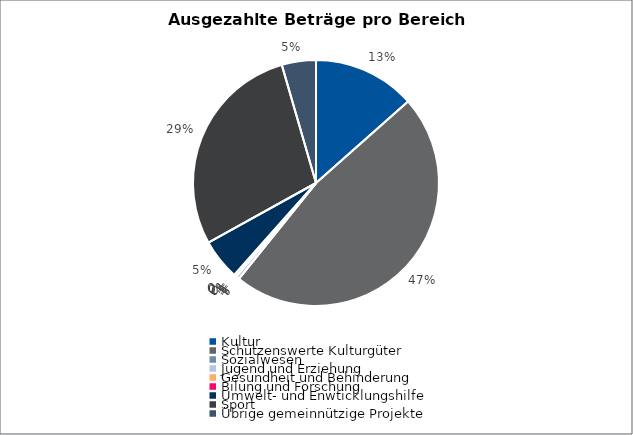
| Category | Series 0 |
|---|---|
| Kultur | 4731371 |
| Schützenswerte Kulturgüter | 16640983 |
| Sozialwesen | 0 |
| Jugend und Erziehung | 165130 |
| Gesundheit und Behinderung | 0 |
| Bilung und Forschung | 105215 |
| Umwelt- und Enwticklungshilfe | 1896788 |
| Sport | 10038498 |
| Übrige gemeinnützige Projekte | 1579613 |